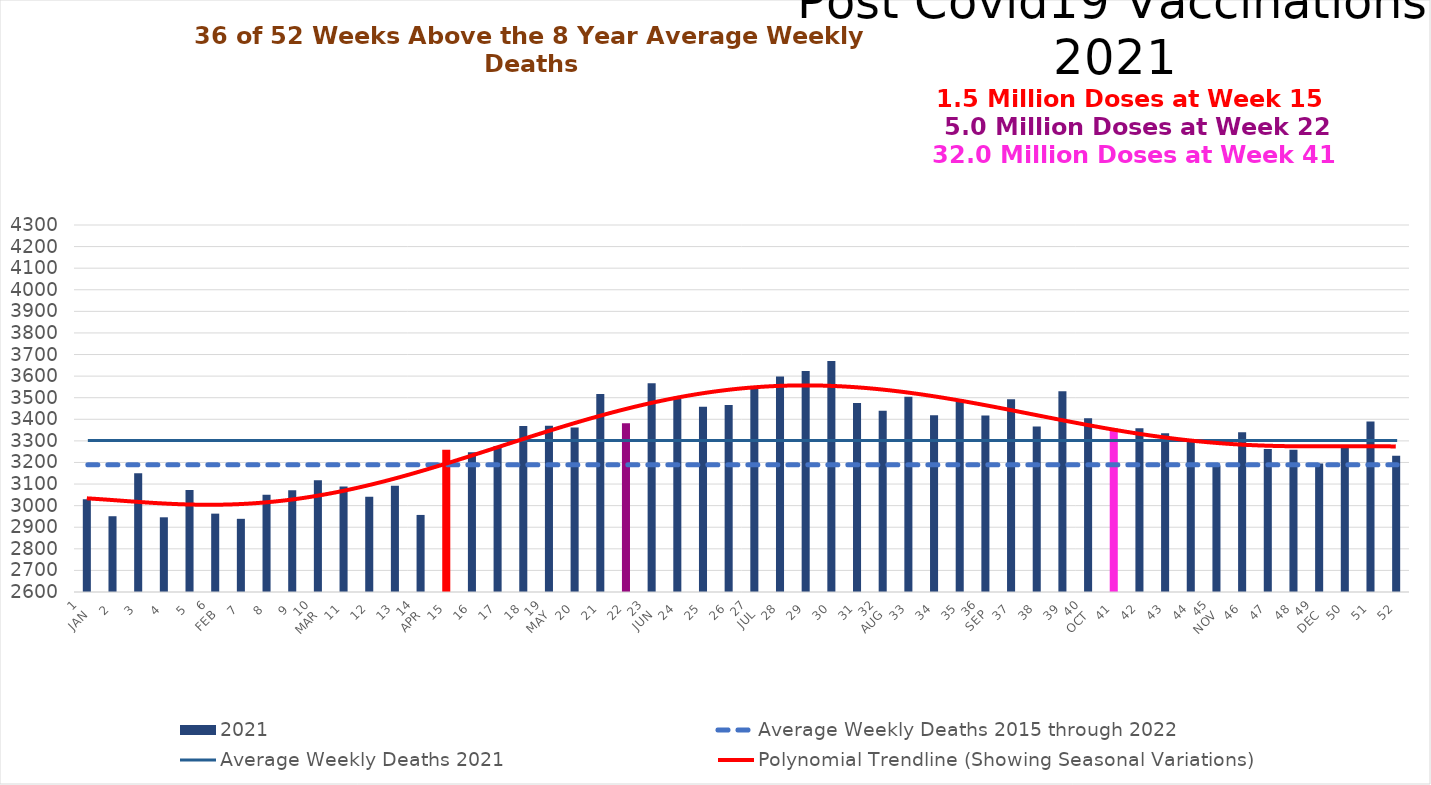
| Category | 2021 |
|---|---|
| 1
JAN | 3030 |
| 2 | 2951 |
| 3 | 3150 |
| 4 | 2946 |
| 5 | 3072 |
| 6
FEB | 2963 |
| 7 | 2939 |
| 8 | 3050 |
| 9 | 3071 |
| 10
MAR | 3118 |
| 11 | 3089 |
| 12 | 3041 |
| 13 | 3092 |
| 14
APR | 2957 |
| 15 | 3259 |
| 16 | 3247 |
| 17 | 3276 |
| 18 | 3369 |
| 19
MAY | 3370 |
| 20 | 3362 |
| 21 | 3517 |
| 22 | 3382 |
| 23
JUN | 3567 |
| 24 | 3494 |
| 25 | 3458 |
| 26 | 3466 |
| 27
JUL | 3545 |
| 28 | 3598 |
| 29 | 3624 |
| 30 | 3670 |
| 31 | 3476 |
| 32
AUG | 3440 |
| 33 | 3504 |
| 34 | 3419 |
| 35 | 3493 |
| 36
SEP | 3418 |
| 37 | 3493 |
| 38 | 3367 |
| 39 | 3530 |
| 40
OCT | 3405 |
| 41 | 3359 |
| 42 | 3359 |
| 43 | 3335 |
| 44 | 3309 |
| 45
NOV | 3186 |
| 46 | 3340 |
| 47 | 3262 |
| 48 | 3259 |
| 49
DEC | 3195 |
| 50 | 3275 |
| 51 | 3390 |
| 52 | 3231 |